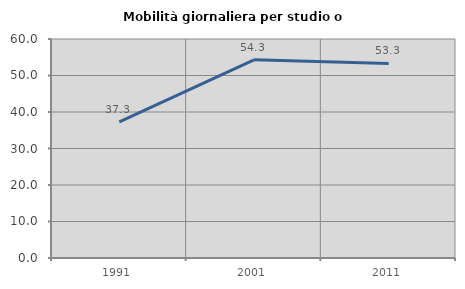
| Category | Mobilità giornaliera per studio o lavoro |
|---|---|
| 1991.0 | 37.291 |
| 2001.0 | 54.301 |
| 2011.0 | 53.321 |